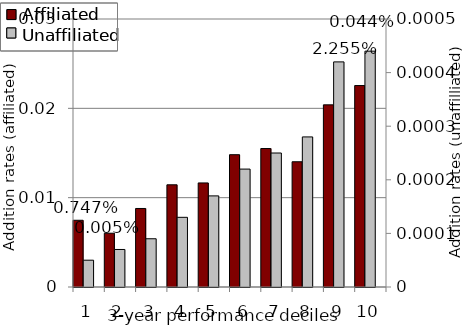
| Category | Affiliated | Series 1 | Series 2 |
|---|---|---|---|
| 0 | 0.007 |  |  |
| 1 | 0.006 |  |  |
| 2 | 0.009 |  |  |
| 3 | 0.011 |  |  |
| 4 | 0.012 |  |  |
| 5 | 0.015 |  |  |
| 6 | 0.015 |  |  |
| 7 | 0.014 |  |  |
| 8 | 0.02 |  |  |
| 9 | 0.023 |  |  |